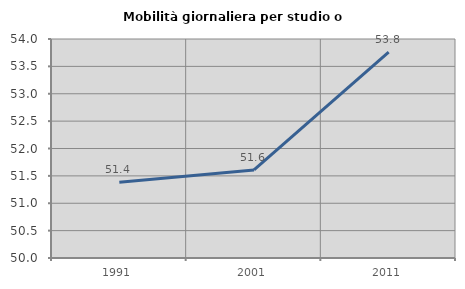
| Category | Mobilità giornaliera per studio o lavoro |
|---|---|
| 1991.0 | 51.385 |
| 2001.0 | 51.609 |
| 2011.0 | 53.762 |